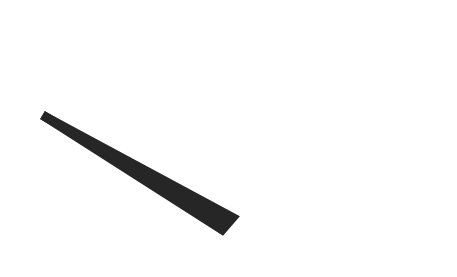
| Category | y |
|---|---|
| 9.362622854571875 | 29.131 |
| 51.16523204812792 | 1.625 |
| 48.83476795187208 | -1.625 |
| 9.362622854571875 | 29.131 |
| 50.0 | 0 |